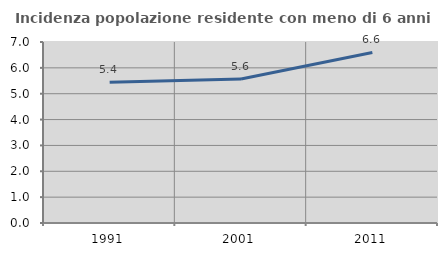
| Category | Incidenza popolazione residente con meno di 6 anni |
|---|---|
| 1991.0 | 5.442 |
| 2001.0 | 5.566 |
| 2011.0 | 6.594 |